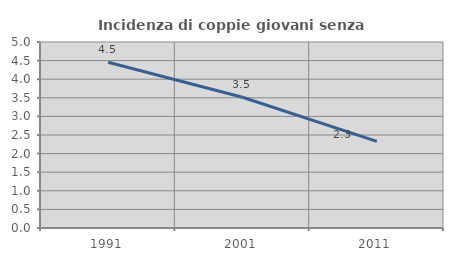
| Category | Incidenza di coppie giovani senza figli |
|---|---|
| 1991.0 | 4.455 |
| 2001.0 | 3.514 |
| 2011.0 | 2.329 |